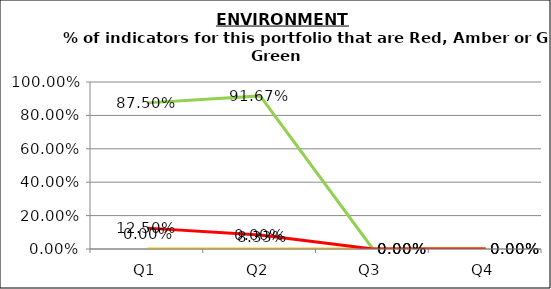
| Category | Green | Amber | Red |
|---|---|---|---|
| Q1 | 0.875 | 0 | 0.125 |
| Q2 | 0.917 | 0 | 0.083 |
| Q3 | 0 | 0 | 0 |
| Q4 | 0 | 0 | 0 |